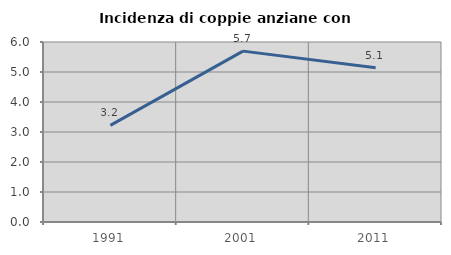
| Category | Incidenza di coppie anziane con figli |
|---|---|
| 1991.0 | 3.219 |
| 2001.0 | 5.696 |
| 2011.0 | 5.145 |